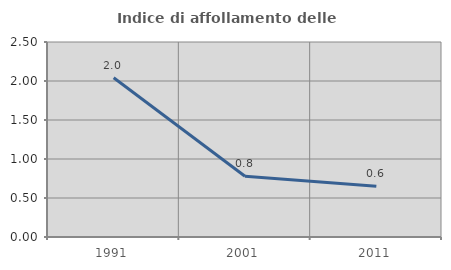
| Category | Indice di affollamento delle abitazioni  |
|---|---|
| 1991.0 | 2.041 |
| 2001.0 | 0.778 |
| 2011.0 | 0.649 |